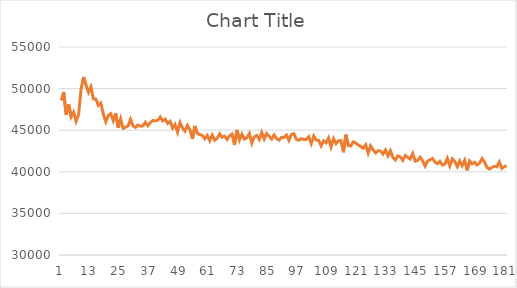
| Category | Series 0 |
|---|---|
| 0 | 48576.8 |
| 1 | 49568.8 |
| 2 | 46854.1 |
| 3 | 48126.5 |
| 4 | 46606.3 |
| 5 | 47172.2 |
| 6 | 46065.6 |
| 7 | 46856.1 |
| 8 | 49906.3 |
| 9 | 51401.3 |
| 10 | 50435 |
| 11 | 49546.2 |
| 12 | 50215.4 |
| 13 | 48762.4 |
| 14 | 48735.1 |
| 15 | 47974 |
| 16 | 48252.4 |
| 17 | 46924.1 |
| 18 | 46019 |
| 19 | 46765.5 |
| 20 | 46976.3 |
| 21 | 46148 |
| 22 | 47029.1 |
| 23 | 45300.4 |
| 24 | 46367.3 |
| 25 | 45217.6 |
| 26 | 45363 |
| 27 | 45512 |
| 28 | 46296.2 |
| 29 | 45510.3 |
| 30 | 45337 |
| 31 | 45622.8 |
| 32 | 45481.3 |
| 33 | 45521.1 |
| 34 | 45954.8 |
| 35 | 45543.1 |
| 36 | 45914.1 |
| 37 | 46171.5 |
| 38 | 46118.2 |
| 39 | 46176.9 |
| 40 | 46587.4 |
| 41 | 46107.9 |
| 42 | 46328 |
| 43 | 45810.2 |
| 44 | 46059.4 |
| 45 | 45255.4 |
| 46 | 45680.2 |
| 47 | 44756.4 |
| 48 | 45914.7 |
| 49 | 45276.6 |
| 50 | 44877.1 |
| 51 | 45577.6 |
| 52 | 45066.7 |
| 53 | 43953.1 |
| 54 | 45507.9 |
| 55 | 44618.2 |
| 56 | 44463.2 |
| 57 | 44379.4 |
| 58 | 43971.8 |
| 59 | 44384.1 |
| 60 | 43741.6 |
| 61 | 44414.1 |
| 62 | 43792.2 |
| 63 | 44033.3 |
| 64 | 44569.4 |
| 65 | 44152.6 |
| 66 | 44287.6 |
| 67 | 43885.7 |
| 68 | 44307.9 |
| 69 | 44532.2 |
| 70 | 43222 |
| 71 | 45030.3 |
| 72 | 43808.2 |
| 73 | 44515.9 |
| 74 | 43921.2 |
| 75 | 44087.2 |
| 76 | 44604.2 |
| 77 | 43437.4 |
| 78 | 44195.6 |
| 79 | 44368.8 |
| 80 | 43886.8 |
| 81 | 44730.7 |
| 82 | 43940.8 |
| 83 | 44598.4 |
| 84 | 44276.1 |
| 85 | 43934.2 |
| 86 | 44427.4 |
| 87 | 43976.8 |
| 88 | 43807.2 |
| 89 | 44147.8 |
| 90 | 44118.6 |
| 91 | 44420.4 |
| 92 | 43770.3 |
| 93 | 44483.7 |
| 94 | 44579.3 |
| 95 | 43898 |
| 96 | 43793 |
| 97 | 43984.8 |
| 98 | 43864.3 |
| 99 | 43900.5 |
| 100 | 44206 |
| 101 | 43392.4 |
| 102 | 44300.7 |
| 103 | 43805.3 |
| 104 | 43800.6 |
| 105 | 43118.1 |
| 106 | 43719.6 |
| 107 | 43488.3 |
| 108 | 44073.7 |
| 109 | 42978.5 |
| 110 | 43978.8 |
| 111 | 43386.3 |
| 112 | 43736.2 |
| 113 | 43750 |
| 114 | 42344.7 |
| 115 | 44460.6 |
| 116 | 43139 |
| 117 | 43118.6 |
| 118 | 43595.3 |
| 119 | 43444.7 |
| 120 | 43225.3 |
| 121 | 43058.6 |
| 122 | 42823.1 |
| 123 | 43244.6 |
| 124 | 42238.7 |
| 125 | 43121.4 |
| 126 | 42643.6 |
| 127 | 42273.6 |
| 128 | 42525.8 |
| 129 | 42502.7 |
| 130 | 42128.1 |
| 131 | 42615.3 |
| 132 | 41910.7 |
| 133 | 42536.9 |
| 134 | 41724.1 |
| 135 | 41420.3 |
| 136 | 41919.3 |
| 137 | 41790.8 |
| 138 | 41385.8 |
| 139 | 41952.1 |
| 140 | 41736.4 |
| 141 | 41540.2 |
| 142 | 42195.1 |
| 143 | 41277.6 |
| 144 | 41346.8 |
| 145 | 41754.2 |
| 146 | 41328.4 |
| 147 | 40683.7 |
| 148 | 41300 |
| 149 | 41437.2 |
| 150 | 41597.9 |
| 151 | 41159.2 |
| 152 | 40978.5 |
| 153 | 41262.6 |
| 154 | 40817.5 |
| 155 | 40918 |
| 156 | 41618.8 |
| 157 | 40711.8 |
| 158 | 41555.2 |
| 159 | 41237.4 |
| 160 | 40616.6 |
| 161 | 41317.8 |
| 162 | 40741.2 |
| 163 | 41379.2 |
| 164 | 40175.4 |
| 165 | 41293.5 |
| 166 | 40943.2 |
| 167 | 41146.8 |
| 168 | 40820.3 |
| 169 | 41035.5 |
| 170 | 41597.1 |
| 171 | 41210.5 |
| 172 | 40523.7 |
| 173 | 40332.2 |
| 174 | 40527.3 |
| 175 | 40657.4 |
| 176 | 40599.3 |
| 177 | 41190.7 |
| 178 | 40413.7 |
| 179 | 40604.5 |
| 180 | 40746.2 |